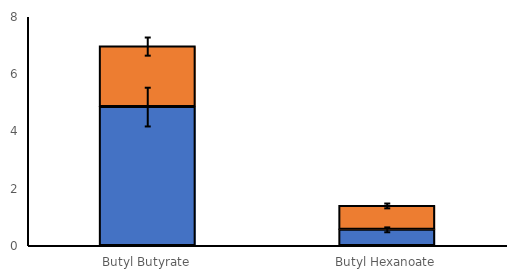
| Category | Culture Broth | Cell pellet |
|---|---|---|
| Butyl Butyrate | 4.852 | 2.114 |
| Butyl Hexanoate | 0.565 | 0.835 |